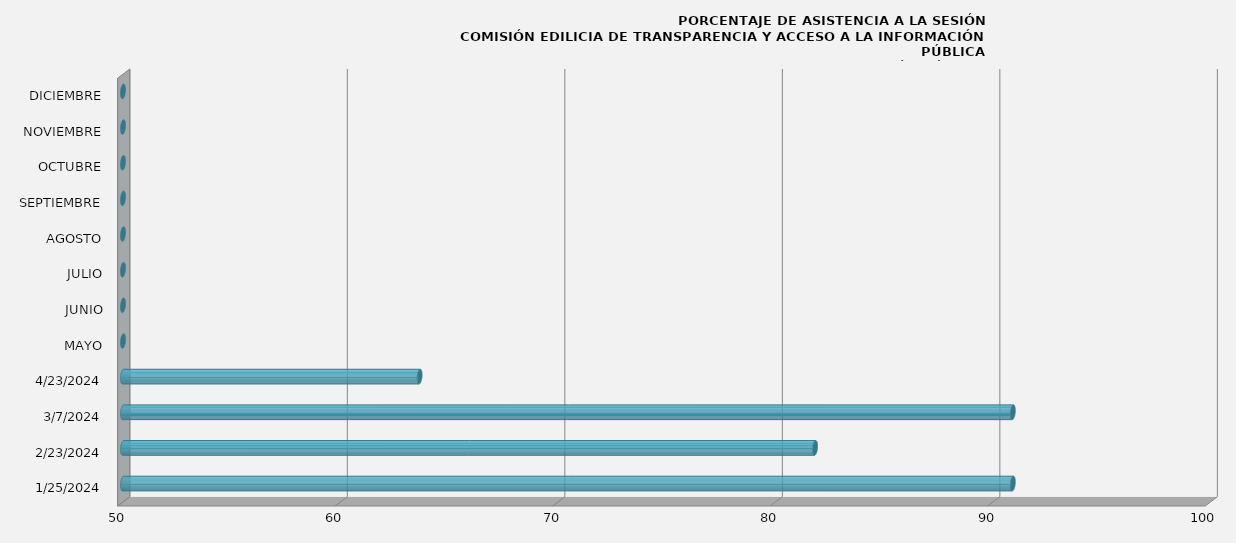
| Category | Series 0 |
|---|---|
| 25/01/2024 | 90.909 |
| 23/02/2024 | 81.818 |
| 07/03/2024 | 90.909 |
| 23/04/2024 | 63.636 |
| MAYO | 0 |
| JUNIO | 0 |
| JULIO | 0 |
| AGOSTO | 0 |
| SEPTIEMBRE | 0 |
| OCTUBRE | 0 |
| NOVIEMBRE | 0 |
| DICIEMBRE | 0 |